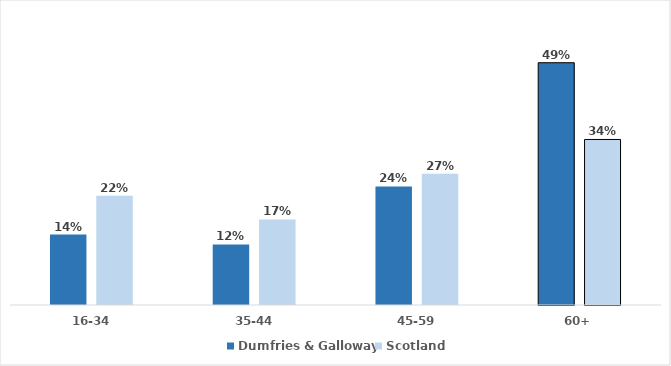
| Category | Dumfries & Galloway | Scotland |
|---|---|---|
| 16-34 | 0.143 | 0.222 |
| 35-44 | 0.123 | 0.174 |
| 45-59 | 0.241 | 0.267 |
| 60+ | 0.493 | 0.337 |